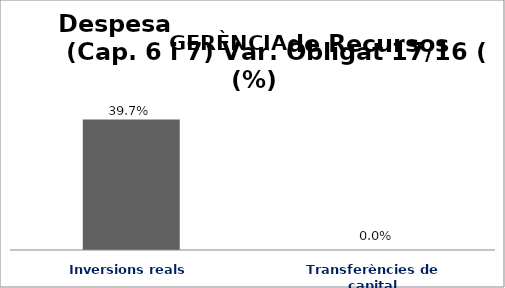
| Category | Series 0 |
|---|---|
| Inversions reals | 0.397 |
| Transferències de capital | 0 |